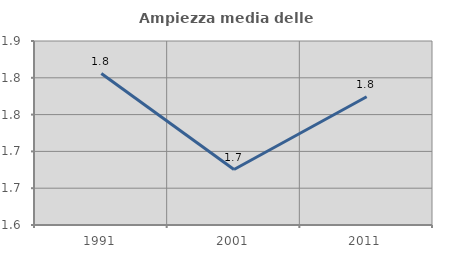
| Category | Ampiezza media delle famiglie |
|---|---|
| 1991.0 | 1.806 |
| 2001.0 | 1.675 |
| 2011.0 | 1.774 |